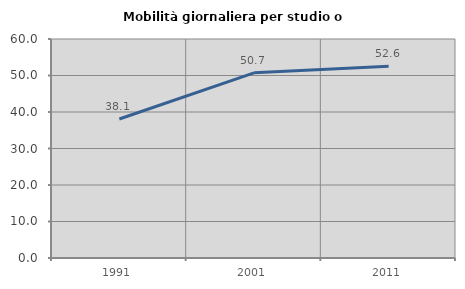
| Category | Mobilità giornaliera per studio o lavoro |
|---|---|
| 1991.0 | 38.081 |
| 2001.0 | 50.72 |
| 2011.0 | 52.552 |